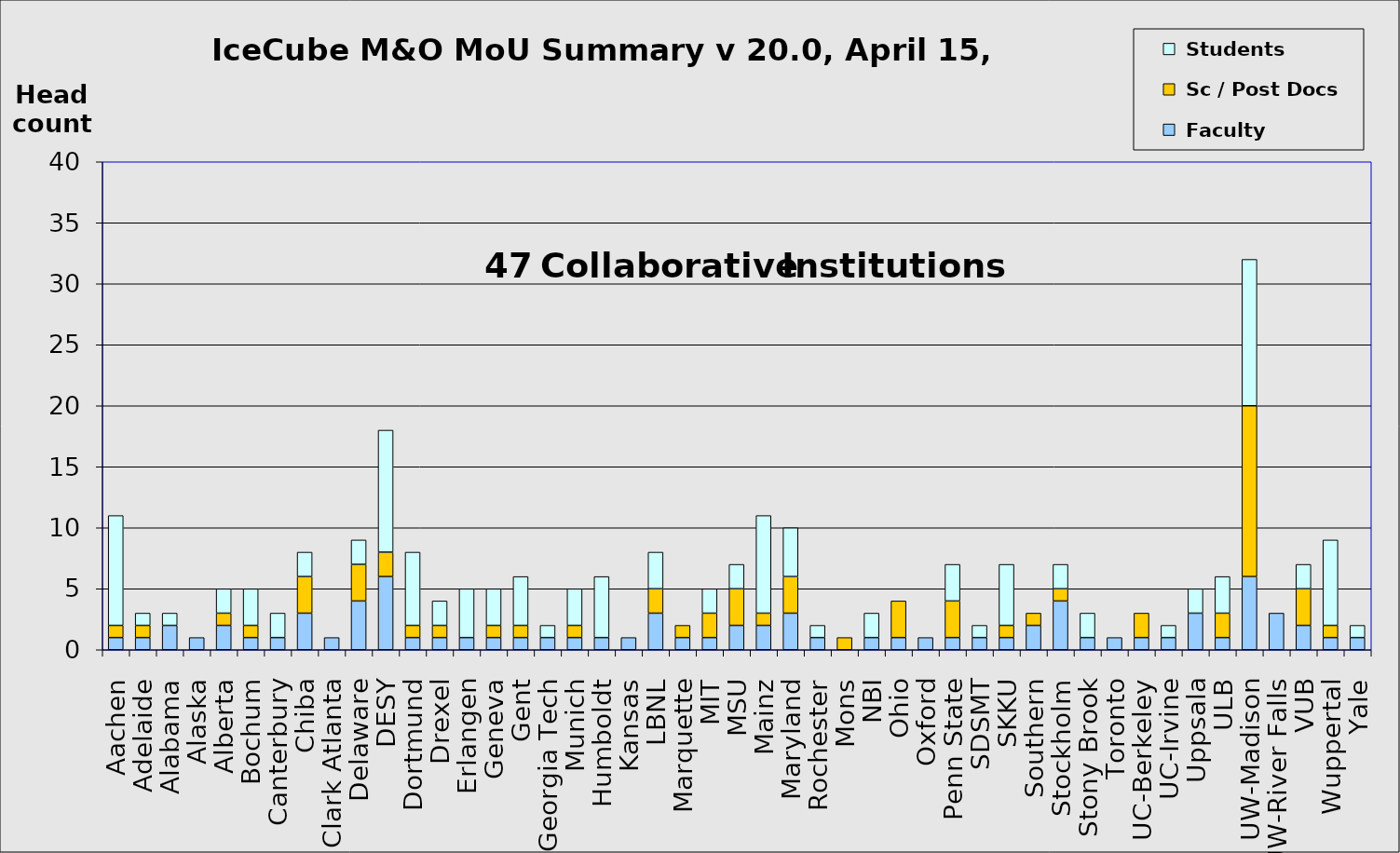
| Category |  Faculty |  Sc / Post Docs |  Students |
|---|---|---|---|
| Aachen | 1 | 1 | 9 |
| Adelaide | 1 | 1 | 1 |
| Alabama | 2 | 0 | 1 |
| Alaska | 1 | 0 | 0 |
| Alberta | 2 | 1 | 2 |
| Bochum | 1 | 1 | 3 |
| Canterbury | 1 | 0 | 2 |
| Chiba | 3 | 3 | 2 |
| Clark Atlanta | 1 | 0 | 0 |
| Delaware | 4 | 3 | 2 |
| DESY | 6 | 2 | 10 |
| Dortmund | 1 | 1 | 6 |
| Drexel | 1 | 1 | 2 |
| Erlangen | 1 | 0 | 4 |
| Geneva | 1 | 1 | 3 |
| Gent | 1 | 1 | 4 |
| Georgia Tech | 1 | 0 | 1 |
| Munich | 1 | 1 | 3 |
| Humboldt | 1 | 0 | 5 |
| Kansas | 1 | 0 | 0 |
| LBNL | 3 | 2 | 3 |
| Marquette | 1 | 1 | 0 |
| MIT | 1 | 2 | 2 |
| MSU | 2 | 3 | 2 |
| Mainz | 2 | 1 | 8 |
| Maryland | 3 | 3 | 4 |
| Rochester | 1 | 0 | 1 |
| Mons | 0 | 1 | 0 |
| NBI | 1 | 0 | 2 |
| Ohio | 1 | 3 | 0 |
| Oxford | 1 | 0 | 0 |
| Penn State | 1 | 3 | 3 |
| SDSMT | 1 | 0 | 1 |
| SKKU | 1 | 1 | 5 |
| Southern | 2 | 1 | 0 |
| Stockholm | 4 | 1 | 2 |
| Stony Brook | 1 | 0 | 2 |
| Toronto | 1 | 0 | 0 |
| UC-Berkeley | 1 | 2 | 0 |
| UC-Irvine | 1 | 0 | 1 |
| Uppsala | 3 | 0 | 2 |
| ULB | 1 | 2 | 3 |
| UW-Madison | 6 | 14 | 12 |
| UW-River Falls | 3 | 0 | 0 |
| VUB | 2 | 3 | 2 |
| Wuppertal | 1 | 1 | 7 |
| Yale | 1 | 0 | 1 |